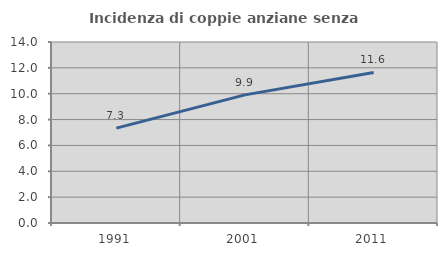
| Category | Incidenza di coppie anziane senza figli  |
|---|---|
| 1991.0 | 7.341 |
| 2001.0 | 9.909 |
| 2011.0 | 11.644 |